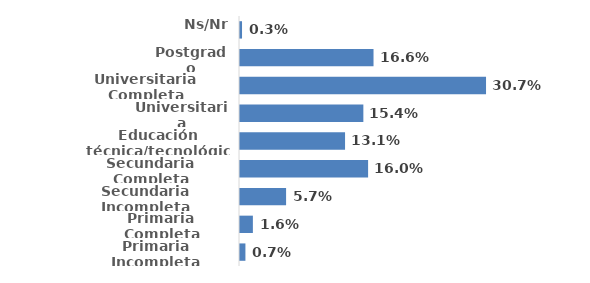
| Category | Series 0 |
|---|---|
| Primaria Incompleta | 0.007 |
| Primaria Completa | 0.016 |
| Secundaria Incompleta | 0.057 |
| Secundaria Completa | 0.16 |
| Educación técnica/tecnológica | 0.131 |
| Universitaria Incompleta | 0.154 |
| Universitaria Completa | 0.307 |
| Postgrado | 0.166 |
| Ns/Nr | 0.003 |